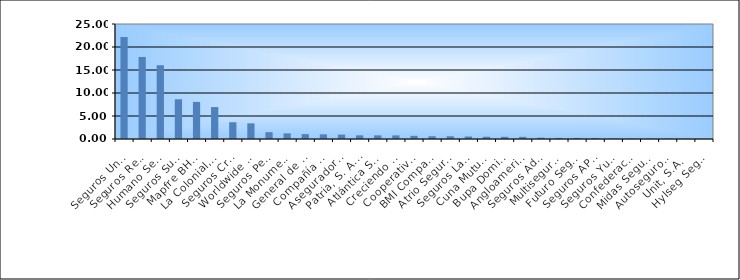
| Category | Series 0 |
|---|---|
| Seguros Universal, S. A. | 22.18 |
| Seguros Reservas, S. A. | 17.837 |
| Humano Seguros, S. A. | 16.037 |
| Seguros Sura, S.A. | 8.636 |
| Mapfre BHD Compañía de Seguros | 8.061 |
| La Colonial, S. A., Compañia De Seguros | 6.943 |
| Seguros Crecer, S. A. | 3.642 |
| Worldwide Seguros, S. A. | 3.397 |
| Seguros Pepín, S. A. | 1.487 |
| La Monumental de Seguros, S. A. | 1.224 |
| General de Seguros, S. A. | 1.065 |
| Compañía Dominicana de Seguros, C. por A. | 1.01 |
| Aseguradora Agropecuaria Dominicana, S. A. | 0.947 |
| Patria, S. A., Compañía de Seguros | 0.799 |
| Atlántica Seguros, S. A. | 0.789 |
| Creciendo Seguros | 0.789 |
| Cooperativa Nacional De Seguros, Inc  | 0.692 |
| BMI Compañía de Seguros, S. A. | 0.605 |
| Atrio Seguros S. A. | 0.595 |
| Seguros La Internacional, S. A. | 0.544 |
| Cuna Mutual Insurance Society Dominicana | 0.491 |
| Bupa Dominicana, S. A. | 0.475 |
| Angloamericana de Seguros, S. A. | 0.465 |
| Seguros Ademi, S.A. | 0.279 |
| Multiseguros Su, S.A. | 0.232 |
| Futuro Seguros | 0.229 |
| Seguros APS, S.R.L. | 0.213 |
| Seguros Yunen, S.A. | 0.081 |
| Confederación del Canadá Dominicana, S. A. | 0.075 |
| Midas Seguros, S.A. | 0.067 |
| Autoseguro, S. A. | 0.058 |
| Unit, S.A. | 0.043 |
| Hylseg Seguros S.A | 0.014 |